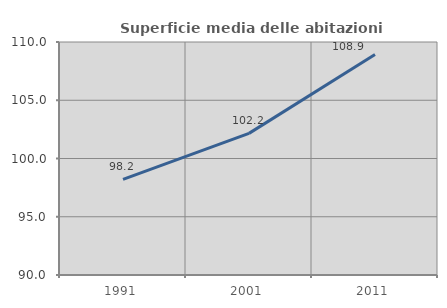
| Category | Superficie media delle abitazioni occupate |
|---|---|
| 1991.0 | 98.207 |
| 2001.0 | 102.157 |
| 2011.0 | 108.933 |